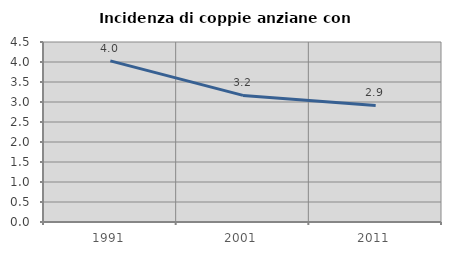
| Category | Incidenza di coppie anziane con figli |
|---|---|
| 1991.0 | 4.029 |
| 2001.0 | 3.165 |
| 2011.0 | 2.915 |